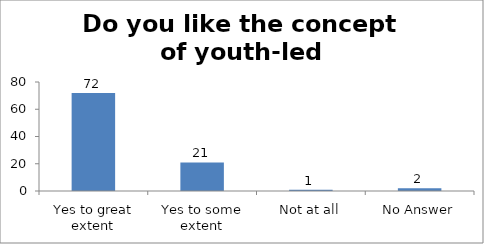
| Category | Do you like the concept of youth-led changemaking?  |
|---|---|
| Yes to great extent | 72 |
| Yes to some extent | 21 |
| Not at all | 1 |
| No Answer | 2 |